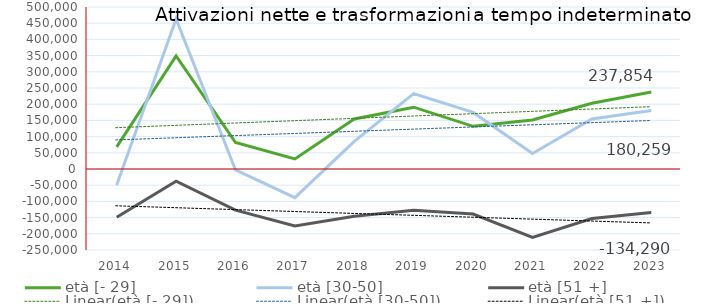
| Category | età [- 29] | età [30-50] | età [51 +] |
|---|---|---|---|
| 2014.0 | 68204 | -49740 | -148653 |
| 2015.0 | 348865 | 463147 | -37373 |
| 2016.0 | 81817 | -2926 | -127008 |
| 2017.0 | 31188 | -88567 | -176151 |
| 2018.0 | 154263 | 85101 | -145664 |
| 2019.0 | 190754 | 232552 | -127230 |
| 2020.0 | 131693 | 174706 | -139062 |
| 2021.0 | 151161 | 47729 | -211272 |
| 2022.0 | 202691 | 154313 | -152646 |
| 2023.0 | 237854 | 180259 | -134290 |